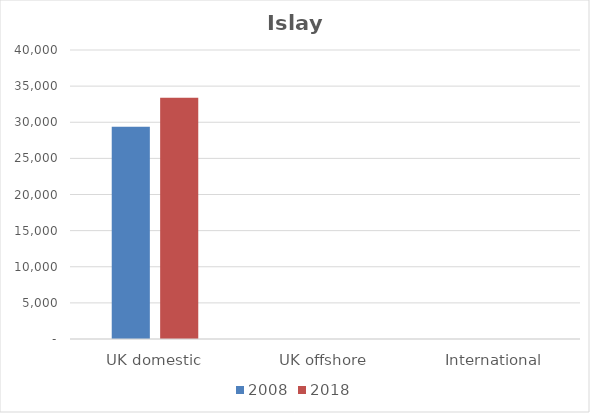
| Category | 2008 | 2018 |
|---|---|---|
| UK domestic | 29367 | 33383 |
| UK offshore | 0 | 0 |
| International | 0 | 0 |